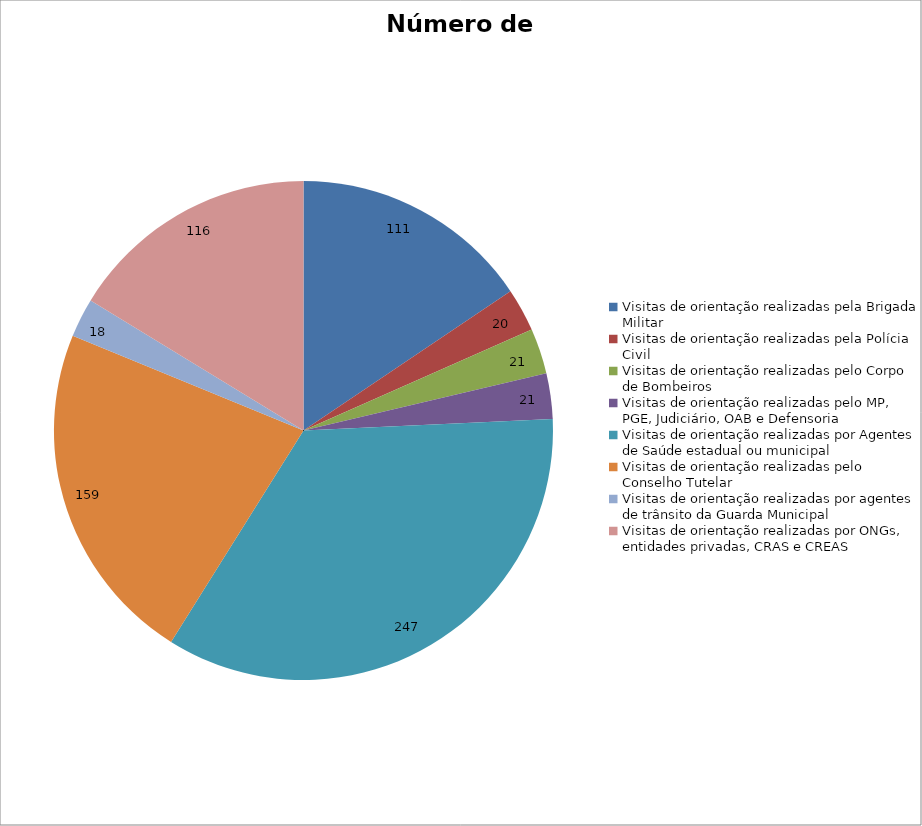
| Category | Número de Ações |
|---|---|
| Visitas de orientação realizadas pela Brigada Militar | 111 |
| Visitas de orientação realizadas pela Polícia Civil | 20 |
| Visitas de orientação realizadas pelo Corpo de Bombeiros | 21 |
| Visitas de orientação realizadas pelo MP, PGE, Judiciário, OAB e Defensoria | 21 |
| Visitas de orientação realizadas por Agentes de Saúde estadual ou municipal | 247 |
| Visitas de orientação realizadas pelo Conselho Tutelar | 159 |
| Visitas de orientação realizadas por agentes de trânsito da Guarda Municipal | 18 |
| Visitas de orientação realizadas por ONGs, entidades privadas, CRAS e CREAS | 116 |